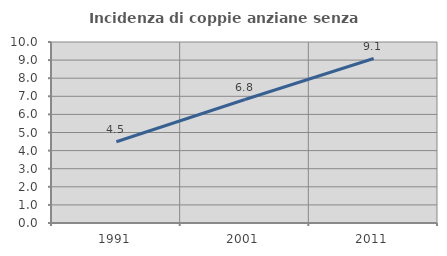
| Category | Incidenza di coppie anziane senza figli  |
|---|---|
| 1991.0 | 4.489 |
| 2001.0 | 6.821 |
| 2011.0 | 9.088 |